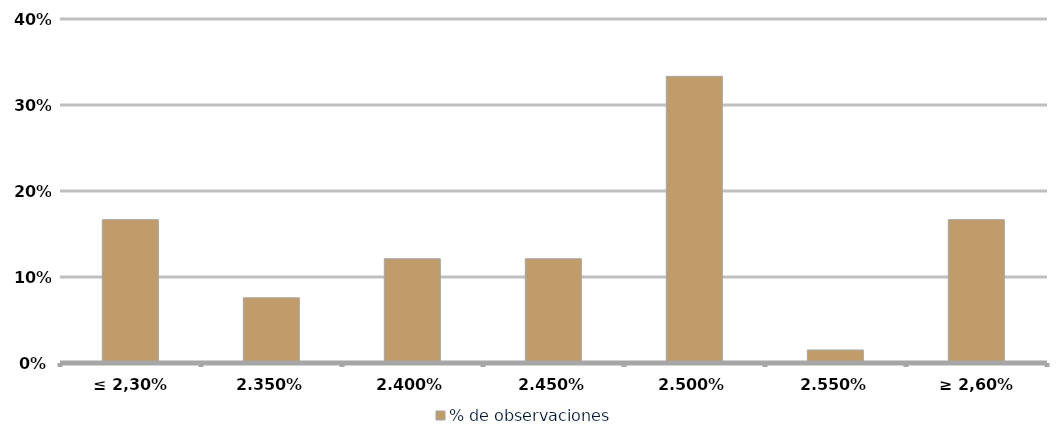
| Category | % de observaciones  |
|---|---|
| ≤ 2,30% | 0.167 |
| 2,35% | 0.076 |
| 2,40% | 0.121 |
| 2,45% | 0.121 |
| 2,50% | 0.333 |
| 2,55% | 0.015 |
| ≥ 2,60% | 0.167 |